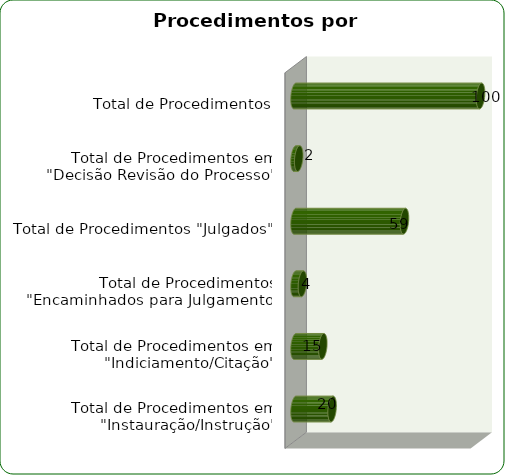
| Category | Series 0 |
|---|---|
| Total de Procedimentos em "Instauração/Instrução" | 20 |
| Total de Procedimentos em "Indiciamento/Citação" | 15 |
| Total de Procedimentos "Encaminhados para Julgamento" | 4 |
| Total de Procedimentos "Julgados" | 59 |
| Total de Procedimentos em "Decisão Revisão do Processo"  | 2 |
| Total de Procedimentos | 100 |